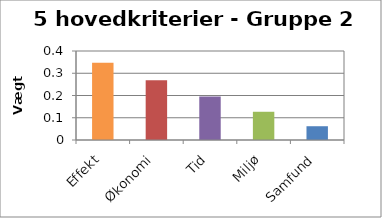
| Category | Vægt 2 |
|---|---|
| Effekt | 0.347 |
| Økonomi | 0.269 |
| Tid | 0.196 |
| Miljø | 0.127 |
| Samfund | 0.062 |